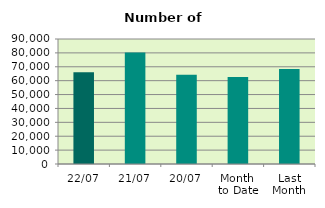
| Category | Series 0 |
|---|---|
| 22/07 | 66064 |
| 21/07 | 80200 |
| 20/07 | 64236 |
| Month 
to Date | 62562.25 |
| Last
Month | 68392.182 |